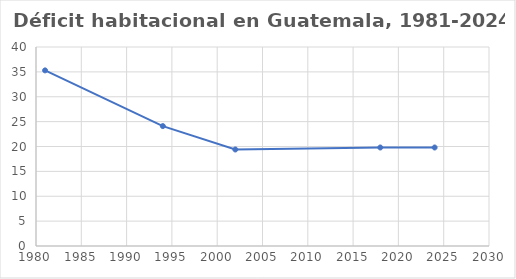
| Category | % |
|---|---|
| 1981.0 | 35.3 |
| 1994.0 | 24.1 |
| 2002.0 | 19.4 |
| 2018.0 | 19.8 |
| 2024.0 | 19.8 |